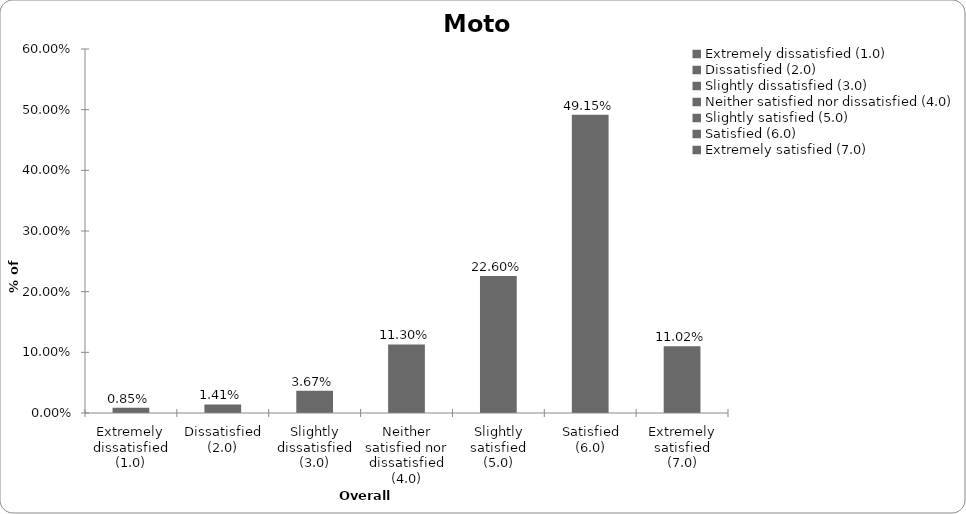
| Category | Series 0 |
|---|---|
| Extremely dissatisfied (1.0) | 0.008 |
| Dissatisfied (2.0) | 0.014 |
| Slightly dissatisfied (3.0) | 0.037 |
| Neither satisfied nor dissatisfied (4.0) | 0.113 |
| Slightly satisfied (5.0) | 0.226 |
| Satisfied (6.0) | 0.492 |
| Extremely satisfied (7.0) | 0.11 |